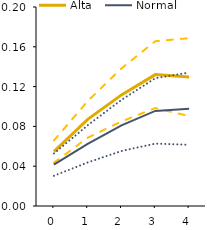
| Category | Alta | Series 4 | Series 5 | Normal | Series 1 | Series 2 |
|---|---|---|---|---|---|---|
| 0.0 | 0.055 | 0.066 | 0.043 | 0.042 | 0.053 | 0.03 |
| 1.0 | 0.087 | 0.105 | 0.069 | 0.062 | 0.081 | 0.044 |
| 2.0 | 0.112 | 0.138 | 0.085 | 0.081 | 0.107 | 0.055 |
| 3.0 | 0.132 | 0.166 | 0.098 | 0.096 | 0.128 | 0.063 |
| 4.0 | 0.13 | 0.169 | 0.09 | 0.098 | 0.134 | 0.062 |